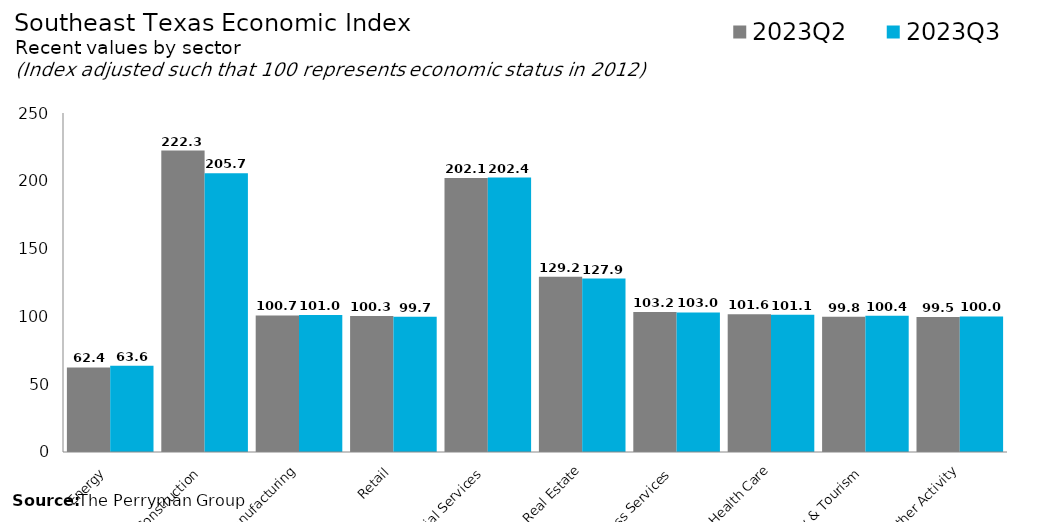
| Category | 2023Q2 | 2023Q3 |
|---|---|---|
| Energy | 62.401 | 63.561 |
| Construction | 222.259 | 205.659 |
| Manufacturing | 100.701 | 100.965 |
| Retail | 100.318 | 99.656 |
| Financial Services | 202.062 | 202.42 |
| Real Estate | 129.235 | 127.884 |
| Professional & Business Services | 103.207 | 102.96 |
| Health Care | 101.626 | 101.125 |
| Hospitality & Tourism | 99.766 | 100.444 |
| Other Activity | 99.52 | 99.966 |